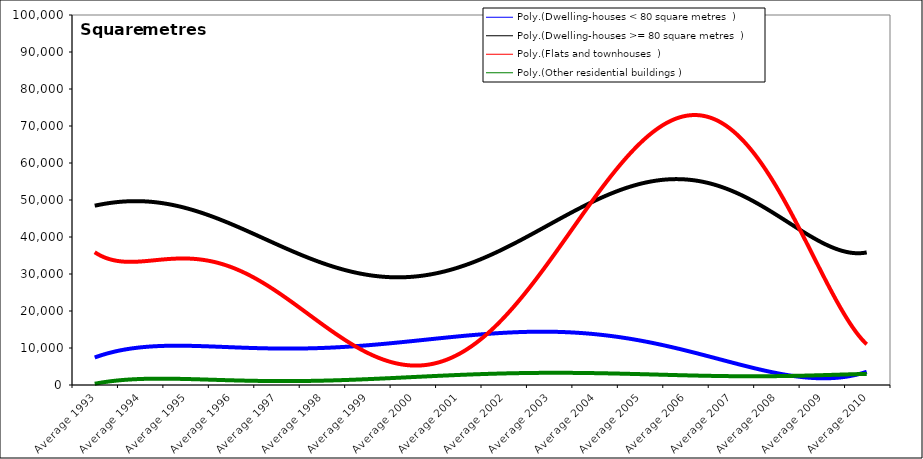
| Category | Dwelling-houses < 80 square metres | Dwelling-houses >= 80 square metres | Flats and townhouses | Other residential buildings |
|---|---|---|---|---|
| Average 1993 | 8362.833 | 49150.667 | 36251.333 | 749 |
| Average 1994 | 8597.75 | 46004 | 30730.25 | 976.667 |
| Average 1995 | 9236.167 | 53843.667 | 40228.083 | 564.083 |
| Average 1996 | 12336.083 | 42175.083 | 27082.333 | 2702.5 |
| Average 1997 | 10219.25 | 33807.833 | 26253.917 | 2061.583 |
| Average 1998 | 10805.667 | 35337.083 | 14789.5 | 1157.583 |
| Average 1999 | 13502.667 | 28354.25 | 8151 | 568.25 |
| Average 2000 | 8646.667 | 33005.417 | 9747 | 1034.333 |
| Average 2001 | 8365.917 | 29737.917 | 10102.917 | 1691.667 |
| Average 2002 | 7953.167 | 36527.083 | 15495.667 | 5879.333 |
| Average 2003 | 29804.667 | 43954.917 | 29153.917 | 2207.167 |
| Average 2004 | 13668.167 | 50620.5 | 43213.25 | 5505.417 |
| Average 2005 | 9015.167 | 51747.583 | 86738.583 | 853.833 |
| Average 2006 | 5352.833 | 56357.083 | 62931.5 | 2518.083 |
| Average 2007 | 5147.25 | 51162.917 | 62257.333 | 2044.333 |
| Average 2008 | 5934.583 | 51678.5 | 61256.083 | 2785.167 |
| Average 2009 | 2800.333 | 33403.75 | 27874.833 | 3131.667 |
| Average 2010 | 2701.5 | 37262.333 | 11103.333 | 2713.333 |